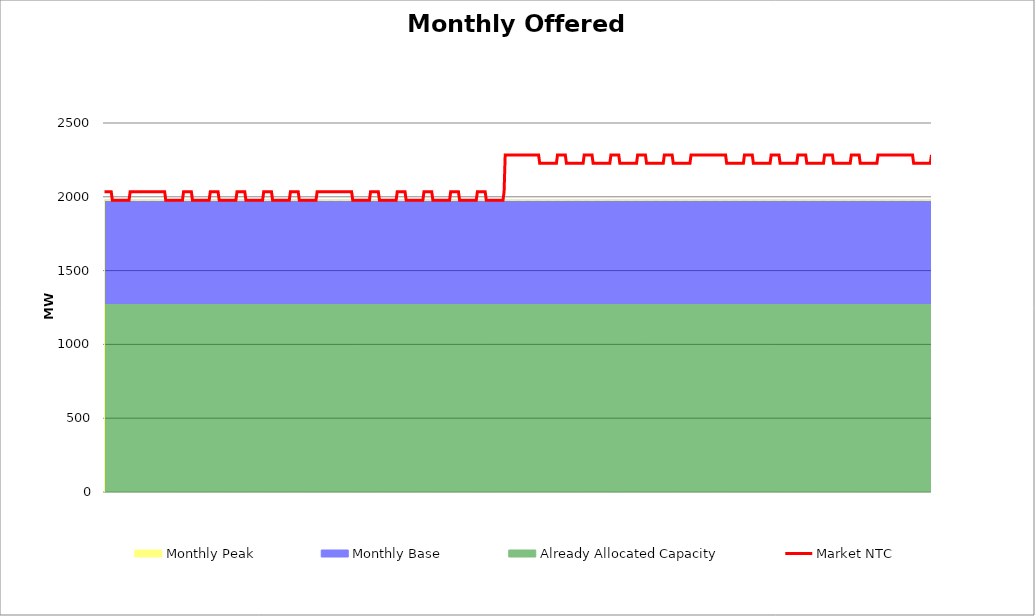
| Category | Market NTC |
|---|---|
| 0 | 2034 |
| 1 | 2034 |
| 2 | 2034 |
| 3 | 2034 |
| 4 | 2034 |
| 5 | 2034 |
| 6 | 2034 |
| 7 | 1977 |
| 8 | 1977 |
| 9 | 1977 |
| 10 | 1977 |
| 11 | 1977 |
| 12 | 1977 |
| 13 | 1977 |
| 14 | 1977 |
| 15 | 1977 |
| 16 | 1977 |
| 17 | 1977 |
| 18 | 1977 |
| 19 | 1977 |
| 20 | 1977 |
| 21 | 1977 |
| 22 | 1977 |
| 23 | 2034 |
| 24 | 2034 |
| 25 | 2034 |
| 26 | 2034 |
| 27 | 2034 |
| 28 | 2034 |
| 29 | 2034 |
| 30 | 2034 |
| 31 | 2034 |
| 32 | 2034 |
| 33 | 2034 |
| 34 | 2034 |
| 35 | 2034 |
| 36 | 2034 |
| 37 | 2034 |
| 38 | 2034 |
| 39 | 2034 |
| 40 | 2034 |
| 41 | 2034 |
| 42 | 2034 |
| 43 | 2034 |
| 44 | 2034 |
| 45 | 2034 |
| 46 | 2034 |
| 47 | 2034 |
| 48 | 2034 |
| 49 | 2034 |
| 50 | 2034 |
| 51 | 2034 |
| 52 | 2034 |
| 53 | 2034 |
| 54 | 2034 |
| 55 | 1977 |
| 56 | 1977 |
| 57 | 1977 |
| 58 | 1977 |
| 59 | 1977 |
| 60 | 1977 |
| 61 | 1977 |
| 62 | 1977 |
| 63 | 1977 |
| 64 | 1977 |
| 65 | 1977 |
| 66 | 1977 |
| 67 | 1977 |
| 68 | 1977 |
| 69 | 1977 |
| 70 | 1977 |
| 71 | 2034 |
| 72 | 2034 |
| 73 | 2034 |
| 74 | 2034 |
| 75 | 2034 |
| 76 | 2034 |
| 77 | 2034 |
| 78 | 2034 |
| 79 | 1977 |
| 80 | 1977 |
| 81 | 1977 |
| 82 | 1977 |
| 83 | 1977 |
| 84 | 1977 |
| 85 | 1977 |
| 86 | 1977 |
| 87 | 1977 |
| 88 | 1977 |
| 89 | 1977 |
| 90 | 1977 |
| 91 | 1977 |
| 92 | 1977 |
| 93 | 1977 |
| 94 | 1977 |
| 95 | 2034 |
| 96 | 2034 |
| 97 | 2034 |
| 98 | 2034 |
| 99 | 2034 |
| 100 | 2034 |
| 101 | 2034 |
| 102 | 2034 |
| 103 | 1977 |
| 104 | 1977 |
| 105 | 1977 |
| 106 | 1977 |
| 107 | 1977 |
| 108 | 1977 |
| 109 | 1977 |
| 110 | 1977 |
| 111 | 1977 |
| 112 | 1977 |
| 113 | 1977 |
| 114 | 1977 |
| 115 | 1977 |
| 116 | 1977 |
| 117 | 1977 |
| 118 | 1977 |
| 119 | 2034 |
| 120 | 2034 |
| 121 | 2034 |
| 122 | 2034 |
| 123 | 2034 |
| 124 | 2034 |
| 125 | 2034 |
| 126 | 2034 |
| 127 | 1977 |
| 128 | 1977 |
| 129 | 1977 |
| 130 | 1977 |
| 131 | 1977 |
| 132 | 1977 |
| 133 | 1977 |
| 134 | 1977 |
| 135 | 1977 |
| 136 | 1977 |
| 137 | 1977 |
| 138 | 1977 |
| 139 | 1977 |
| 140 | 1977 |
| 141 | 1977 |
| 142 | 1977 |
| 143 | 2034 |
| 144 | 2034 |
| 145 | 2034 |
| 146 | 2034 |
| 147 | 2034 |
| 148 | 2034 |
| 149 | 2034 |
| 150 | 2034 |
| 151 | 1977 |
| 152 | 1977 |
| 153 | 1977 |
| 154 | 1977 |
| 155 | 1977 |
| 156 | 1977 |
| 157 | 1977 |
| 158 | 1977 |
| 159 | 1977 |
| 160 | 1977 |
| 161 | 1977 |
| 162 | 1977 |
| 163 | 1977 |
| 164 | 1977 |
| 165 | 1977 |
| 166 | 1977 |
| 167 | 2034 |
| 168 | 2034 |
| 169 | 2034 |
| 170 | 2034 |
| 171 | 2034 |
| 172 | 2034 |
| 173 | 2034 |
| 174 | 2034 |
| 175 | 1977 |
| 176 | 1977 |
| 177 | 1977 |
| 178 | 1977 |
| 179 | 1977 |
| 180 | 1977 |
| 181 | 1977 |
| 182 | 1977 |
| 183 | 1977 |
| 184 | 1977 |
| 185 | 1977 |
| 186 | 1977 |
| 187 | 1977 |
| 188 | 1977 |
| 189 | 1977 |
| 190 | 1977 |
| 191 | 2034 |
| 192 | 2034 |
| 193 | 2034 |
| 194 | 2034 |
| 195 | 2034 |
| 196 | 2034 |
| 197 | 2034 |
| 198 | 2034 |
| 199 | 2034 |
| 200 | 2034 |
| 201 | 2034 |
| 202 | 2034 |
| 203 | 2034 |
| 204 | 2034 |
| 205 | 2034 |
| 206 | 2034 |
| 207 | 2034 |
| 208 | 2034 |
| 209 | 2034 |
| 210 | 2034 |
| 211 | 2034 |
| 212 | 2034 |
| 213 | 2034 |
| 214 | 2034 |
| 215 | 2034 |
| 216 | 2034 |
| 217 | 2034 |
| 218 | 2034 |
| 219 | 2034 |
| 220 | 2034 |
| 221 | 2034 |
| 222 | 2034 |
| 223 | 1977 |
| 224 | 1977 |
| 225 | 1977 |
| 226 | 1977 |
| 227 | 1977 |
| 228 | 1977 |
| 229 | 1977 |
| 230 | 1977 |
| 231 | 1977 |
| 232 | 1977 |
| 233 | 1977 |
| 234 | 1977 |
| 235 | 1977 |
| 236 | 1977 |
| 237 | 1977 |
| 238 | 1977 |
| 239 | 2034 |
| 240 | 2034 |
| 241 | 2034 |
| 242 | 2034 |
| 243 | 2034 |
| 244 | 2034 |
| 245 | 2034 |
| 246 | 2034 |
| 247 | 1977 |
| 248 | 1977 |
| 249 | 1977 |
| 250 | 1977 |
| 251 | 1977 |
| 252 | 1977 |
| 253 | 1977 |
| 254 | 1977 |
| 255 | 1977 |
| 256 | 1977 |
| 257 | 1977 |
| 258 | 1977 |
| 259 | 1977 |
| 260 | 1977 |
| 261 | 1977 |
| 262 | 1977 |
| 263 | 2034 |
| 264 | 2034 |
| 265 | 2034 |
| 266 | 2034 |
| 267 | 2034 |
| 268 | 2034 |
| 269 | 2034 |
| 270 | 2034 |
| 271 | 1977 |
| 272 | 1977 |
| 273 | 1977 |
| 274 | 1977 |
| 275 | 1977 |
| 276 | 1977 |
| 277 | 1977 |
| 278 | 1977 |
| 279 | 1977 |
| 280 | 1977 |
| 281 | 1977 |
| 282 | 1977 |
| 283 | 1977 |
| 284 | 1977 |
| 285 | 1977 |
| 286 | 1977 |
| 287 | 2034 |
| 288 | 2034 |
| 289 | 2034 |
| 290 | 2034 |
| 291 | 2034 |
| 292 | 2034 |
| 293 | 2034 |
| 294 | 2034 |
| 295 | 1977 |
| 296 | 1977 |
| 297 | 1977 |
| 298 | 1977 |
| 299 | 1977 |
| 300 | 1977 |
| 301 | 1977 |
| 302 | 1977 |
| 303 | 1977 |
| 304 | 1977 |
| 305 | 1977 |
| 306 | 1977 |
| 307 | 1977 |
| 308 | 1977 |
| 309 | 1977 |
| 310 | 1977 |
| 311 | 2034 |
| 312 | 2034 |
| 313 | 2034 |
| 314 | 2034 |
| 315 | 2034 |
| 316 | 2034 |
| 317 | 2034 |
| 318 | 2034 |
| 319 | 1977 |
| 320 | 1977 |
| 321 | 1977 |
| 322 | 1977 |
| 323 | 1977 |
| 324 | 1977 |
| 325 | 1977 |
| 326 | 1977 |
| 327 | 1977 |
| 328 | 1977 |
| 329 | 1977 |
| 330 | 1977 |
| 331 | 1977 |
| 332 | 1977 |
| 333 | 1977 |
| 334 | 1977 |
| 335 | 2034 |
| 336 | 2034 |
| 337 | 2034 |
| 338 | 2034 |
| 339 | 2034 |
| 340 | 2034 |
| 341 | 2034 |
| 342 | 2034 |
| 343 | 1977 |
| 344 | 1977 |
| 345 | 1977 |
| 346 | 1977 |
| 347 | 1977 |
| 348 | 1977 |
| 349 | 1977 |
| 350 | 1977 |
| 351 | 1977 |
| 352 | 1977 |
| 353 | 1977 |
| 354 | 1977 |
| 355 | 1977 |
| 356 | 1977 |
| 357 | 1977 |
| 358 | 1977 |
| 359 | 2034 |
| 360 | 2284 |
| 361 | 2284 |
| 362 | 2284 |
| 363 | 2284 |
| 364 | 2284 |
| 365 | 2284 |
| 366 | 2284 |
| 367 | 2284 |
| 368 | 2284 |
| 369 | 2284 |
| 370 | 2284 |
| 371 | 2284 |
| 372 | 2284 |
| 373 | 2284 |
| 374 | 2284 |
| 375 | 2284 |
| 376 | 2284 |
| 377 | 2284 |
| 378 | 2284 |
| 379 | 2284 |
| 380 | 2284 |
| 381 | 2284 |
| 382 | 2284 |
| 383 | 2284 |
| 384 | 2284 |
| 385 | 2284 |
| 386 | 2284 |
| 387 | 2284 |
| 388 | 2284 |
| 389 | 2284 |
| 390 | 2284 |
| 391 | 2227 |
| 392 | 2227 |
| 393 | 2227 |
| 394 | 2227 |
| 395 | 2227 |
| 396 | 2227 |
| 397 | 2227 |
| 398 | 2227 |
| 399 | 2227 |
| 400 | 2227 |
| 401 | 2227 |
| 402 | 2227 |
| 403 | 2227 |
| 404 | 2227 |
| 405 | 2227 |
| 406 | 2227 |
| 407 | 2284 |
| 408 | 2284 |
| 409 | 2284 |
| 410 | 2284 |
| 411 | 2284 |
| 412 | 2284 |
| 413 | 2284 |
| 414 | 2284 |
| 415 | 2227 |
| 416 | 2227 |
| 417 | 2227 |
| 418 | 2227 |
| 419 | 2227 |
| 420 | 2227 |
| 421 | 2227 |
| 422 | 2227 |
| 423 | 2227 |
| 424 | 2227 |
| 425 | 2227 |
| 426 | 2227 |
| 427 | 2227 |
| 428 | 2227 |
| 429 | 2227 |
| 430 | 2227 |
| 431 | 2284 |
| 432 | 2284 |
| 433 | 2284 |
| 434 | 2284 |
| 435 | 2284 |
| 436 | 2284 |
| 437 | 2284 |
| 438 | 2284 |
| 439 | 2227 |
| 440 | 2227 |
| 441 | 2227 |
| 442 | 2227 |
| 443 | 2227 |
| 444 | 2227 |
| 445 | 2227 |
| 446 | 2227 |
| 447 | 2227 |
| 448 | 2227 |
| 449 | 2227 |
| 450 | 2227 |
| 451 | 2227 |
| 452 | 2227 |
| 453 | 2227 |
| 454 | 2227 |
| 455 | 2284 |
| 456 | 2284 |
| 457 | 2284 |
| 458 | 2284 |
| 459 | 2284 |
| 460 | 2284 |
| 461 | 2284 |
| 462 | 2284 |
| 463 | 2227 |
| 464 | 2227 |
| 465 | 2227 |
| 466 | 2227 |
| 467 | 2227 |
| 468 | 2227 |
| 469 | 2227 |
| 470 | 2227 |
| 471 | 2227 |
| 472 | 2227 |
| 473 | 2227 |
| 474 | 2227 |
| 475 | 2227 |
| 476 | 2227 |
| 477 | 2227 |
| 478 | 2227 |
| 479 | 2284 |
| 480 | 2284 |
| 481 | 2284 |
| 482 | 2284 |
| 483 | 2284 |
| 484 | 2284 |
| 485 | 2284 |
| 486 | 2284 |
| 487 | 2227 |
| 488 | 2227 |
| 489 | 2227 |
| 490 | 2227 |
| 491 | 2227 |
| 492 | 2227 |
| 493 | 2227 |
| 494 | 2227 |
| 495 | 2227 |
| 496 | 2227 |
| 497 | 2227 |
| 498 | 2227 |
| 499 | 2227 |
| 500 | 2227 |
| 501 | 2227 |
| 502 | 2227 |
| 503 | 2284 |
| 504 | 2284 |
| 505 | 2284 |
| 506 | 2284 |
| 507 | 2284 |
| 508 | 2284 |
| 509 | 2284 |
| 510 | 2284 |
| 511 | 2227 |
| 512 | 2227 |
| 513 | 2227 |
| 514 | 2227 |
| 515 | 2227 |
| 516 | 2227 |
| 517 | 2227 |
| 518 | 2227 |
| 519 | 2227 |
| 520 | 2227 |
| 521 | 2227 |
| 522 | 2227 |
| 523 | 2227 |
| 524 | 2227 |
| 525 | 2227 |
| 526 | 2227 |
| 527 | 2284 |
| 528 | 2284 |
| 529 | 2284 |
| 530 | 2284 |
| 531 | 2284 |
| 532 | 2284 |
| 533 | 2284 |
| 534 | 2284 |
| 535 | 2284 |
| 536 | 2284 |
| 537 | 2284 |
| 538 | 2284 |
| 539 | 2284 |
| 540 | 2284 |
| 541 | 2284 |
| 542 | 2284 |
| 543 | 2284 |
| 544 | 2284 |
| 545 | 2284 |
| 546 | 2284 |
| 547 | 2284 |
| 548 | 2284 |
| 549 | 2284 |
| 550 | 2284 |
| 551 | 2284 |
| 552 | 2284 |
| 553 | 2284 |
| 554 | 2284 |
| 555 | 2284 |
| 556 | 2284 |
| 557 | 2284 |
| 558 | 2284 |
| 559 | 2227 |
| 560 | 2227 |
| 561 | 2227 |
| 562 | 2227 |
| 563 | 2227 |
| 564 | 2227 |
| 565 | 2227 |
| 566 | 2227 |
| 567 | 2227 |
| 568 | 2227 |
| 569 | 2227 |
| 570 | 2227 |
| 571 | 2227 |
| 572 | 2227 |
| 573 | 2227 |
| 574 | 2227 |
| 575 | 2284 |
| 576 | 2284 |
| 577 | 2284 |
| 578 | 2284 |
| 579 | 2284 |
| 580 | 2284 |
| 581 | 2284 |
| 582 | 2284 |
| 583 | 2227 |
| 584 | 2227 |
| 585 | 2227 |
| 586 | 2227 |
| 587 | 2227 |
| 588 | 2227 |
| 589 | 2227 |
| 590 | 2227 |
| 591 | 2227 |
| 592 | 2227 |
| 593 | 2227 |
| 594 | 2227 |
| 595 | 2227 |
| 596 | 2227 |
| 597 | 2227 |
| 598 | 2227 |
| 599 | 2284 |
| 600 | 2284 |
| 601 | 2284 |
| 602 | 2284 |
| 603 | 2284 |
| 604 | 2284 |
| 605 | 2284 |
| 606 | 2284 |
| 607 | 2227 |
| 608 | 2227 |
| 609 | 2227 |
| 610 | 2227 |
| 611 | 2227 |
| 612 | 2227 |
| 613 | 2227 |
| 614 | 2227 |
| 615 | 2227 |
| 616 | 2227 |
| 617 | 2227 |
| 618 | 2227 |
| 619 | 2227 |
| 620 | 2227 |
| 621 | 2227 |
| 622 | 2227 |
| 623 | 2284 |
| 624 | 2284 |
| 625 | 2284 |
| 626 | 2284 |
| 627 | 2284 |
| 628 | 2284 |
| 629 | 2284 |
| 630 | 2284 |
| 631 | 2227 |
| 632 | 2227 |
| 633 | 2227 |
| 634 | 2227 |
| 635 | 2227 |
| 636 | 2227 |
| 637 | 2227 |
| 638 | 2227 |
| 639 | 2227 |
| 640 | 2227 |
| 641 | 2227 |
| 642 | 2227 |
| 643 | 2227 |
| 644 | 2227 |
| 645 | 2227 |
| 646 | 2227 |
| 647 | 2284 |
| 648 | 2284 |
| 649 | 2284 |
| 650 | 2284 |
| 651 | 2284 |
| 652 | 2284 |
| 653 | 2284 |
| 654 | 2284 |
| 655 | 2227 |
| 656 | 2227 |
| 657 | 2227 |
| 658 | 2227 |
| 659 | 2227 |
| 660 | 2227 |
| 661 | 2227 |
| 662 | 2227 |
| 663 | 2227 |
| 664 | 2227 |
| 665 | 2227 |
| 666 | 2227 |
| 667 | 2227 |
| 668 | 2227 |
| 669 | 2227 |
| 670 | 2227 |
| 671 | 2284 |
| 672 | 2284 |
| 673 | 2284 |
| 674 | 2284 |
| 675 | 2284 |
| 676 | 2284 |
| 677 | 2284 |
| 678 | 2284 |
| 679 | 2227 |
| 680 | 2227 |
| 681 | 2227 |
| 682 | 2227 |
| 683 | 2227 |
| 684 | 2227 |
| 685 | 2227 |
| 686 | 2227 |
| 687 | 2227 |
| 688 | 2227 |
| 689 | 2227 |
| 690 | 2227 |
| 691 | 2227 |
| 692 | 2227 |
| 693 | 2227 |
| 694 | 2227 |
| 695 | 2284 |
| 696 | 2284 |
| 697 | 2284 |
| 698 | 2284 |
| 699 | 2284 |
| 700 | 2284 |
| 701 | 2284 |
| 702 | 2284 |
| 703 | 2284 |
| 704 | 2284 |
| 705 | 2284 |
| 706 | 2284 |
| 707 | 2284 |
| 708 | 2284 |
| 709 | 2284 |
| 710 | 2284 |
| 711 | 2284 |
| 712 | 2284 |
| 713 | 2284 |
| 714 | 2284 |
| 715 | 2284 |
| 716 | 2284 |
| 717 | 2284 |
| 718 | 2284 |
| 719 | 2284 |
| 720 | 2284 |
| 721 | 2284 |
| 722 | 2284 |
| 723 | 2284 |
| 724 | 2284 |
| 725 | 2284 |
| 726 | 2284 |
| 727 | 2227 |
| 728 | 2227 |
| 729 | 2227 |
| 730 | 2227 |
| 731 | 2227 |
| 732 | 2227 |
| 733 | 2227 |
| 734 | 2227 |
| 735 | 2227 |
| 736 | 2227 |
| 737 | 2227 |
| 738 | 2227 |
| 739 | 2227 |
| 740 | 2227 |
| 741 | 2227 |
| 742 | 2227 |
| 743 | 2284 |